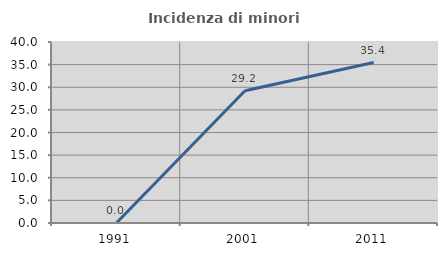
| Category | Incidenza di minori stranieri |
|---|---|
| 1991.0 | 0 |
| 2001.0 | 29.231 |
| 2011.0 | 35.45 |